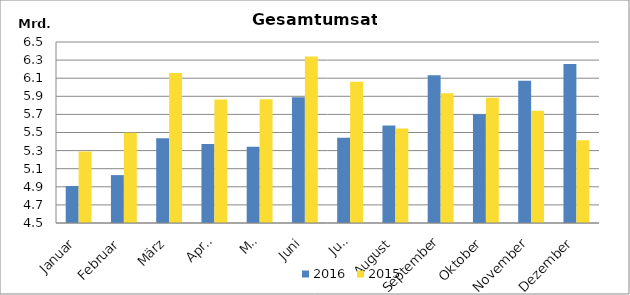
| Category | 2016 | 2015 |
|---|---|---|
| Januar | 4908315.017 | 5290078.04 |
| Februar | 5029169.818 | 5498444.443 |
| März | 5437102.529 | 6158405.401 |
| April | 5373794.987 | 5864139.717 |
| Mai | 5341318.472 | 5867262.853 |
| Juni | 5889271.137 | 6339256.904 |
| Juli | 5443197.652 | 6060900.428 |
| August | 5578710.091 | 5543393.547 |
| September | 6131580.671 | 5934439.15 |
| Oktober | 5702482.579 | 5883584.37 |
| November | 6073053.847 | 5739964.292 |
| Dezember | 6256032.904 | 5414652.492 |